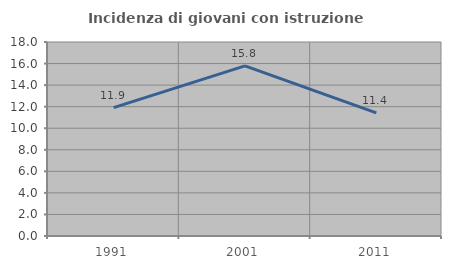
| Category | Incidenza di giovani con istruzione universitaria |
|---|---|
| 1991.0 | 11.905 |
| 2001.0 | 15.789 |
| 2011.0 | 11.429 |